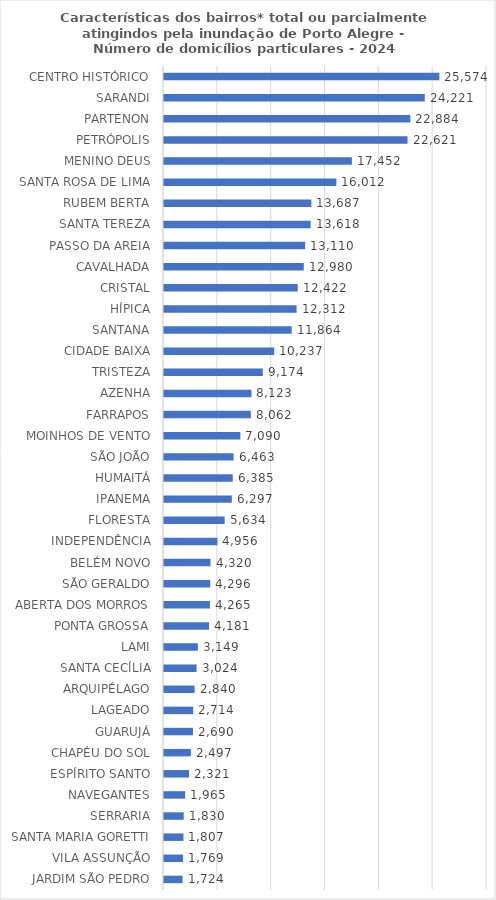
| Category | Domicílio particular |
|---|---|
| CENTRO HISTÓRICO | 25574 |
| SARANDI | 24221 |
| PARTENON | 22884 |
| PETRÓPOLIS | 22621 |
| MENINO DEUS | 17452 |
| SANTA ROSA DE LIMA | 16012 |
| RUBEM BERTA | 13687 |
| SANTA TEREZA | 13618 |
| PASSO DA AREIA | 13110 |
| CAVALHADA | 12980 |
| CRISTAL | 12422 |
| HÍPICA | 12312 |
| SANTANA | 11864 |
| CIDADE BAIXA | 10237 |
| TRISTEZA | 9174 |
| AZENHA | 8123 |
| FARRAPOS | 8062 |
| MOINHOS DE VENTO | 7090 |
| SÃO JOÃO | 6463 |
| HUMAITÁ | 6385 |
| IPANEMA | 6297 |
| FLORESTA | 5634 |
| INDEPENDÊNCIA | 4956 |
| BELÉM NOVO | 4320 |
| SÃO GERALDO | 4296 |
| ABERTA DOS MORROS | 4265 |
| PONTA GROSSA | 4181 |
| LAMI | 3149 |
| SANTA CECÍLIA | 3024 |
| ARQUIPÉLAGO | 2840 |
| LAGEADO | 2714 |
| GUARUJÁ | 2690 |
| CHAPÉU DO SOL | 2497 |
| ESPÍRITO SANTO | 2321 |
| NAVEGANTES | 1965 |
| SERRARIA | 1830 |
| SANTA MARIA GORETTI | 1807 |
| VILA ASSUNÇÃO | 1769 |
| JARDIM SÃO PEDRO | 1724 |